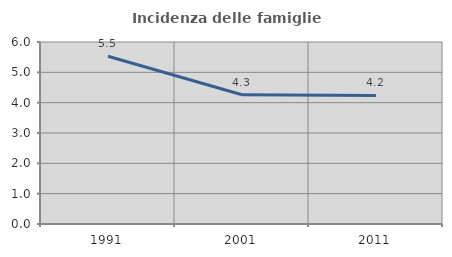
| Category | Incidenza delle famiglie numerose |
|---|---|
| 1991.0 | 5.529 |
| 2001.0 | 4.261 |
| 2011.0 | 4.237 |